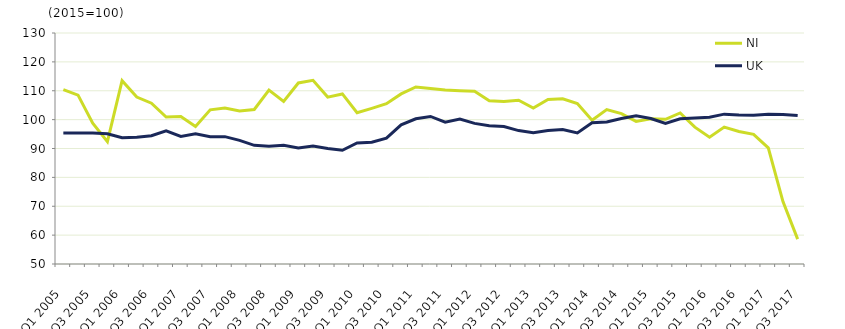
| Category | NI  | UK  |
|---|---|---|
| Q1 2005 | 110.4 | 95.4 |
|  | 108.5 | 95.4 |
| Q3 2005 | 98.8 | 95.4 |
|  | 92.4 | 95.1 |
| Q1 2006 | 113.5 | 93.7 |
|  | 107.8 | 93.9 |
| Q3 2006 | 105.7 | 94.4 |
|  | 100.9 | 96.1 |
| Q1 2007 | 101.1 | 94.2 |
|  | 97.6 | 95.1 |
| Q3 2007 | 103.4 | 94.1 |
|  | 104 | 94.1 |
| Q1 2008 | 103 | 92.8 |
|  | 103.5 | 91.1 |
| Q3 2008 | 110.2 | 90.8 |
|  | 106.3 | 91.1 |
| Q1 2009 | 112.7 | 90.2 |
|  | 113.6 | 90.9 |
| Q3 2009 | 107.8 | 90 |
|  | 108.9 | 89.4 |
| Q1 2010 | 102.4 | 91.9 |
|  | 103.9 | 92.2 |
| Q3 2010 | 105.5 | 93.6 |
|  | 108.9 | 98.2 |
| Q1 2011 | 111.3 | 100.3 |
|  | 110.8 | 101.1 |
| Q3 2011 | 110.3 | 99.1 |
|  | 110 | 100.2 |
| Q1 2012 | 109.8 | 98.7 |
|  | 106.5 | 97.9 |
| Q3 2012 | 106.3 | 97.6 |
|  | 106.7 | 96.2 |
| Q1 2013 | 104 | 95.5 |
|  | 107 | 96.2 |
| Q3 2013 | 107.2 | 96.6 |
|  | 105.6 | 95.4 |
| Q1 2014 | 99.8 | 98.9 |
|  | 103.5 | 99.2 |
| Q3 2014 | 102.1 | 100.4 |
|  | 99.4 | 101.3 |
| Q1 2015 | 100.3 | 100.4 |
|  | 100.1 | 98.7 |
| Q3 2015 | 102.3 | 100.3 |
|  | 97.4 | 100.6 |
| Q1 2016 | 93.9 | 100.8 |
|  | 97.4 | 101.9 |
| Q3 2016 | 95.9 | 101.6 |
|  | 94.9 | 101.5 |
| Q1 2017 | 90.2 | 101.9 |
|  | 71.6 | 101.8 |
| Q3 2017 | 58.6 | 101.4 |